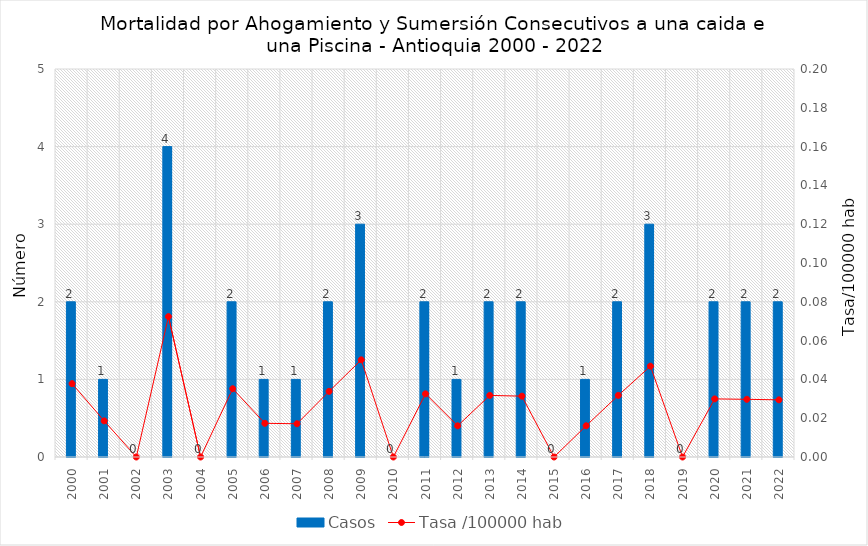
| Category | Casos |
|---|---|
| 2000 | 2 |
| 2001 | 1 |
| 2002 | 0 |
| 2003 | 4 |
| 2004 | 0 |
| 2005 | 2 |
| 2006 | 1 |
| 2007 | 1 |
| 2008 | 2 |
| 2009 | 3 |
| 2010 | 0 |
| 2011 | 2 |
| 2012 | 1 |
| 2013 | 2 |
| 2014 | 2 |
| 2015 | 0 |
| 2016 | 1 |
| 2017 | 2 |
| 2018 | 3 |
| 2019 | 0 |
| 2020 | 2 |
| 2021 | 2 |
| 2022 | 2 |